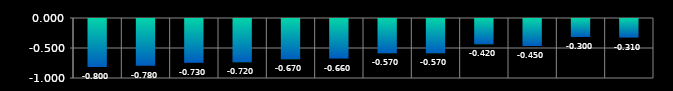
| Category | Series 0 |
|---|---|
| 0 | -0.8 |
| 1 | -0.78 |
| 2 | -0.73 |
| 3 | -0.72 |
| 4 | -0.67 |
| 5 | -0.66 |
| 6 | -0.57 |
| 7 | -0.57 |
| 8 | -0.42 |
| 9 | -0.45 |
| 10 | -0.3 |
| 11 | -0.31 |